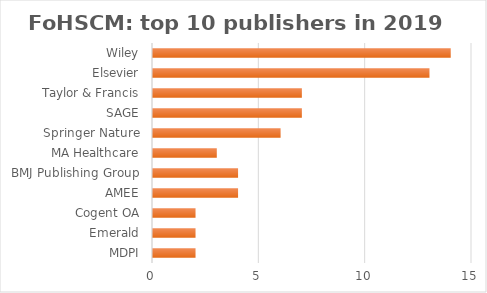
| Category | Series 0 |
|---|---|
| MDPI | 2 |
| Emerald | 2 |
| Cogent OA | 2 |
| AMEE | 4 |
| BMJ Publishing Group | 4 |
| MA Healthcare | 3 |
| Springer Nature | 6 |
| SAGE | 7 |
| Taylor & Francis | 7 |
| Elsevier | 13 |
| Wiley | 14 |